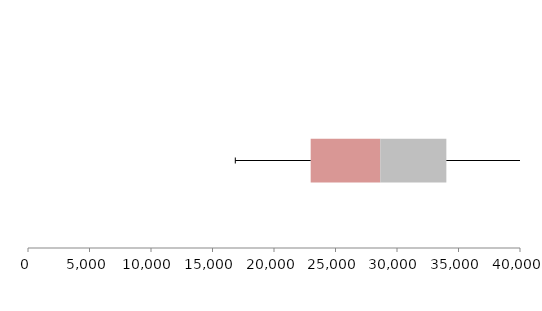
| Category | Series 1 | Series 2 | Series 3 |
|---|---|---|---|
| 0 | 22982.583 | 5656.484 | 5372.945 |